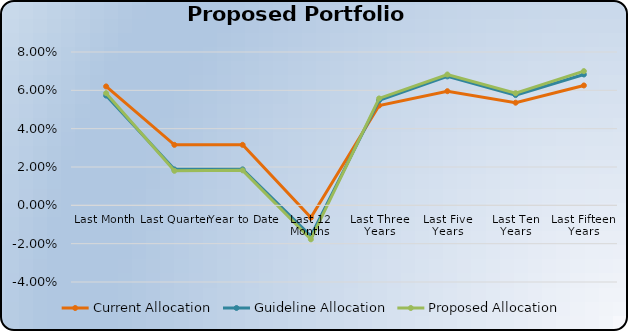
| Category | Current Allocation | Guideline Allocation | Proposed Allocation |
|---|---|---|---|
| Last Month | 0.062 | 0.057 | 0.059 |
| Last Quarter | 0.032 | 0.019 | 0.018 |
| Year to Date | 0.032 | 0.019 | 0.018 |
| Last 12 Months | -0.006 | -0.016 | -0.018 |
| Last Three Years | 0.052 | 0.055 | 0.056 |
| Last Five Years | 0.06 | 0.067 | 0.068 |
| Last Ten Years | 0.054 | 0.058 | 0.059 |
| Last Fifteen Years | 0.063 | 0.068 | 0.07 |